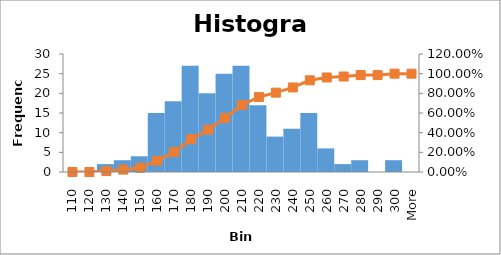
| Category | Frequency |
|---|---|
| 110 | 0 |
| 120 | 0 |
| 130 | 2 |
| 140 | 3 |
| 150 | 4 |
| 160 | 15 |
| 170 | 18 |
| 180 | 27 |
| 190 | 20 |
| 200 | 25 |
| 210 | 27 |
| 220 | 17 |
| 230 | 9 |
| 240 | 11 |
| 250 | 15 |
| 260 | 6 |
| 270 | 2 |
| 280 | 3 |
| 290 | 0 |
| 300 | 3 |
| More | 0 |